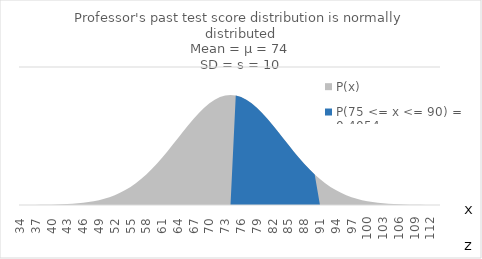
| Category | P(x) |
|---|---|
| 34.0 | 0 |
| 35.0 | 0 |
| 36.0 | 0 |
| 37.0 | 0 |
| 38.0 | 0 |
| 39.0 | 0 |
| 40.0 | 0 |
| 41.0 | 0 |
| 42.0 | 0 |
| 43.0 | 0 |
| 44.0 | 0 |
| 45.0 | 0.001 |
| 46.0 | 0.001 |
| 47.0 | 0.001 |
| 48.0 | 0.001 |
| 49.0 | 0.002 |
| 50.0 | 0.002 |
| 51.0 | 0.003 |
| 52.0 | 0.004 |
| 53.0 | 0.004 |
| 54.0 | 0.005 |
| 55.0 | 0.007 |
| 56.0 | 0.008 |
| 57.0 | 0.009 |
| 58.0 | 0.011 |
| 59.0 | 0.013 |
| 60.0 | 0.015 |
| 61.0 | 0.017 |
| 62.0 | 0.019 |
| 63.0 | 0.022 |
| 64.0 | 0.024 |
| 65.0 | 0.027 |
| 66.0 | 0.029 |
| 67.0 | 0.031 |
| 68.0 | 0.033 |
| 69.0 | 0.035 |
| 70.0 | 0.037 |
| 71.0 | 0.038 |
| 72.0 | 0.039 |
| 73.0 | 0.04 |
| 74.0 | 0.04 |
| 75.0 | 0.04 |
| 76.0 | 0.039 |
| 77.0 | 0.038 |
| 78.0 | 0.037 |
| 79.0 | 0.035 |
| 80.0 | 0.033 |
| 81.0 | 0.031 |
| 82.0 | 0.029 |
| 83.0 | 0.027 |
| 84.0 | 0.024 |
| 85.0 | 0.022 |
| 86.0 | 0.019 |
| 87.0 | 0.017 |
| 88.0 | 0.015 |
| 89.0 | 0.013 |
| 90.0 | 0.011 |
| 91.0 | 0.009 |
| 92.0 | 0.008 |
| 93.0 | 0.007 |
| 94.0 | 0.005 |
| 95.0 | 0.004 |
| 96.0 | 0.004 |
| 97.0 | 0.003 |
| 98.0 | 0.002 |
| 99.0 | 0.002 |
| 100.0 | 0.001 |
| 101.0 | 0.001 |
| 102.0 | 0.001 |
| 103.0 | 0.001 |
| 104.0 | 0 |
| 105.0 | 0 |
| 106.0 | 0 |
| 107.0 | 0 |
| 108.0 | 0 |
| 109.0 | 0 |
| 110.0 | 0 |
| 111.0 | 0 |
| 112.0 | 0 |
| 113.0 | 0 |
| 114.0 | 0 |